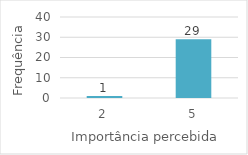
| Category | Series 0 |
|---|---|
| 2.0 | 1 |
| 5.0 | 29 |